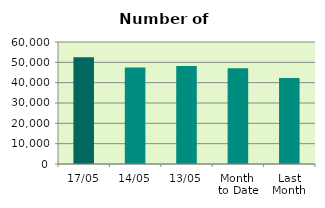
| Category | Series 0 |
|---|---|
| 17/05 | 52444 |
| 14/05 | 47490 |
| 13/05 | 48232 |
| Month 
to Date | 47092 |
| Last
Month | 42252.3 |